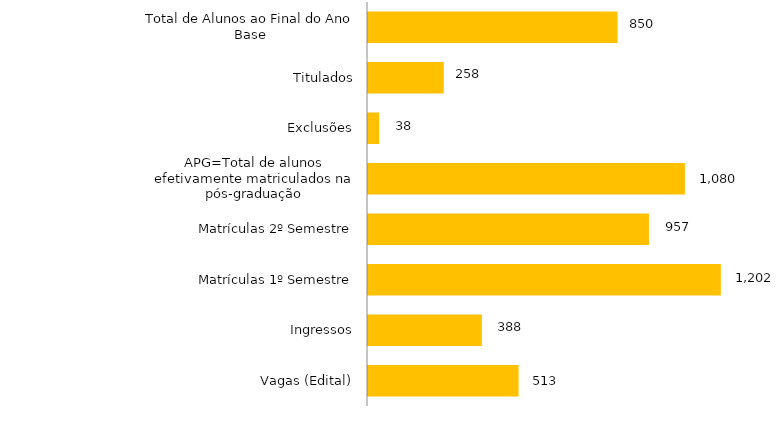
| Category | Curso |
|---|---|
| Vagas (Edital) | 513 |
| Ingressos | 388 |
| Matrículas 1º Semestre | 1202 |
| Matrículas 2º Semestre | 957 |
| APG=Total de alunos efetivamente matriculados na pós-graduação | 1079.5 |
| Exclusões | 38 |
| Titulados | 258 |
| Total de Alunos ao Final do Ano Base | 850 |